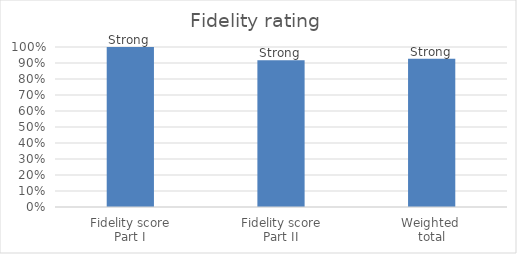
| Category | Series 0 |
|---|---|
| Fidelity score
Part I | 1 |
| Fidelity score
Part II | 0.917 |
| Weighted 
total | 0.927 |